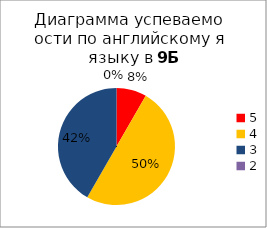
| Category | Series 0 |
|---|---|
| 5.0 | 1 |
| 4.0 | 6 |
| 3.0 | 5 |
| 2.0 | 0 |